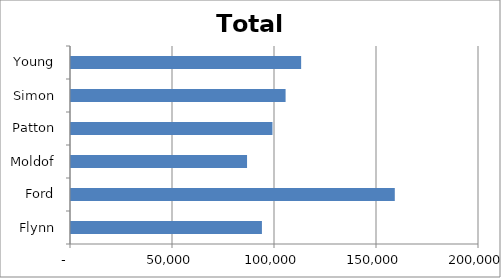
| Category | Series 0 |
|---|---|
| Flynn | 93589 |
| Ford | 158722.14 |
| Moldof | 86298.84 |
| Patton | 98755.27 |
| Simon | 105192.64 |
| Young | 112812.72 |